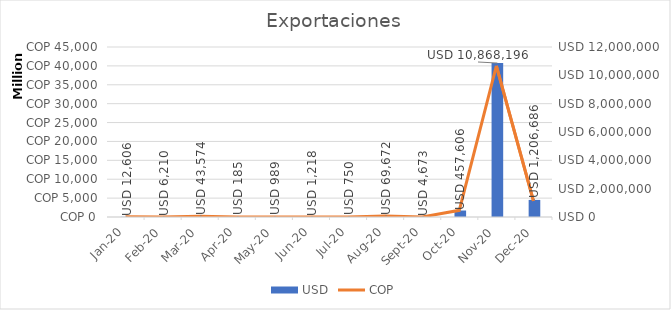
| Category | USD |
|---|---|
| 2020-01-01 | 12606 |
| 2020-02-01 | 6210 |
| 2020-03-01 | 43574 |
| 2020-04-01 | 185 |
| 2020-05-01 | 989 |
| 2020-06-01 | 1218 |
| 2020-07-01 | 750 |
| 2020-08-01 | 69672 |
| 2020-09-01 | 4673 |
| 2020-10-01 | 457606 |
| 2020-11-01 | 10868196 |
| 2020-12-01 | 1206686 |